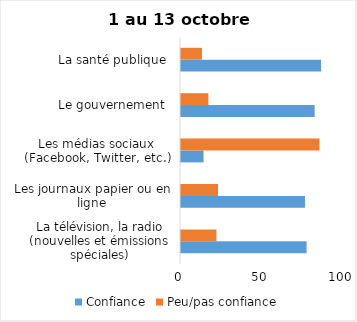
| Category | Confiance | Peu/pas confiance |
|---|---|---|
| La télévision, la radio (nouvelles et émissions spéciales) | 78 | 22 |
| Les journaux papier ou en ligne | 77 | 23 |
| Les médias sociaux (Facebook, Twitter, etc.) | 14 | 86 |
| Le gouvernement  | 83 | 17 |
| La santé publique  | 87 | 13 |